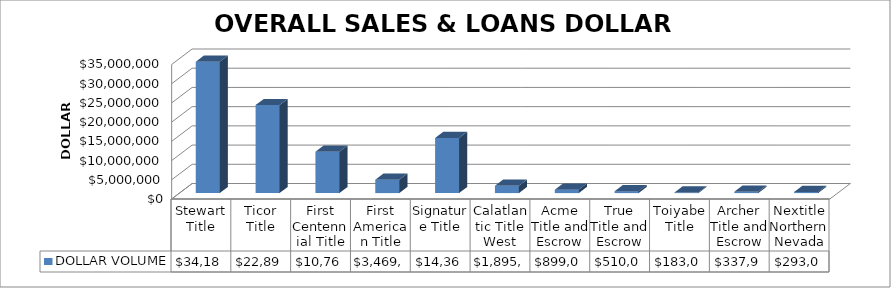
| Category | DOLLAR VOLUME |
|---|---|
| Stewart Title | 34187553 |
| Ticor Title | 22895691 |
| First Centennial Title | 10766955 |
| First American Title | 3469526.35 |
| Signature Title | 14362421 |
| Calatlantic Title West | 1895412 |
| Acme Title and Escrow | 899000 |
| True Title and Escrow | 510000 |
| Toiyabe Title | 183000 |
| Archer Title and Escrow | 337900 |
| Nextitle Northern Nevada | 293040 |